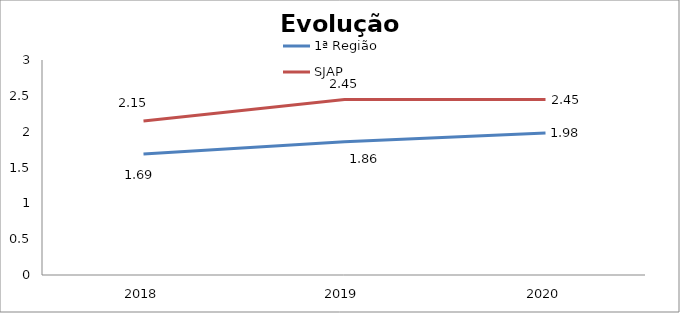
| Category | 1ª Região | SJAP |
|---|---|---|
| 0 | 1.69 | 2.15 |
| 1 | 1.86 | 2.45 |
| 2 | 1.98 | 2.45 |